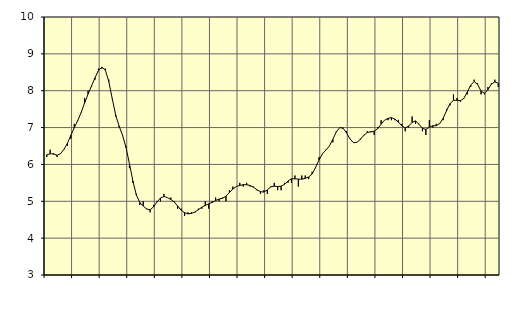
| Category | Piggar | Byggverksamhet, SNI 41-43 |
|---|---|---|
| nan | 6.2 | 6.26 |
| 87.0 | 6.4 | 6.29 |
| 87.0 | 6.3 | 6.28 |
| 87.0 | 6.2 | 6.25 |
| nan | 6.3 | 6.29 |
| 88.0 | 6.4 | 6.41 |
| 88.0 | 6.5 | 6.57 |
| 88.0 | 6.7 | 6.79 |
| nan | 7.1 | 7 |
| 89.0 | 7.2 | 7.19 |
| 89.0 | 7.4 | 7.41 |
| 89.0 | 7.8 | 7.67 |
| nan | 8 | 7.91 |
| 90.0 | 8.1 | 8.13 |
| 90.0 | 8.3 | 8.35 |
| 90.0 | 8.6 | 8.55 |
| nan | 8.6 | 8.64 |
| 91.0 | 8.6 | 8.56 |
| 91.0 | 8.3 | 8.25 |
| 91.0 | 7.8 | 7.79 |
| nan | 7.3 | 7.34 |
| 92.0 | 7 | 7.04 |
| 92.0 | 6.8 | 6.79 |
| 92.0 | 6.5 | 6.46 |
| nan | 5.9 | 6.02 |
| 93.0 | 5.5 | 5.55 |
| 93.0 | 5.2 | 5.17 |
| 93.0 | 4.9 | 4.97 |
| nan | 5 | 4.87 |
| 94.0 | 4.8 | 4.79 |
| 94.0 | 4.7 | 4.77 |
| 94.0 | 4.9 | 4.85 |
| nan | 5 | 4.98 |
| 95.0 | 5 | 5.09 |
| 95.0 | 5.2 | 5.13 |
| 95.0 | 5.1 | 5.1 |
| nan | 5.1 | 5.05 |
| 96.0 | 5 | 4.98 |
| 96.0 | 4.8 | 4.87 |
| 96.0 | 4.8 | 4.76 |
| nan | 4.6 | 4.69 |
| 97.0 | 4.7 | 4.66 |
| 97.0 | 4.7 | 4.67 |
| 97.0 | 4.7 | 4.71 |
| nan | 4.8 | 4.77 |
| 98.0 | 4.8 | 4.84 |
| 98.0 | 5 | 4.89 |
| 98.0 | 4.8 | 4.93 |
| nan | 5 | 4.97 |
| 99.0 | 5.1 | 5.02 |
| 99.0 | 5 | 5.06 |
| 99.0 | 5.1 | 5.08 |
| nan | 5 | 5.14 |
| 0.0 | 5.3 | 5.24 |
| 0.0 | 5.4 | 5.33 |
| 0.0 | 5.4 | 5.4 |
| nan | 5.5 | 5.43 |
| 1.0 | 5.4 | 5.45 |
| 1.0 | 5.5 | 5.45 |
| 1.0 | 5.4 | 5.43 |
| nan | 5.4 | 5.38 |
| 2.0 | 5.3 | 5.31 |
| 2.0 | 5.2 | 5.26 |
| 2.0 | 5.3 | 5.25 |
| nan | 5.2 | 5.31 |
| 3.0 | 5.4 | 5.39 |
| 3.0 | 5.5 | 5.41 |
| 3.0 | 5.3 | 5.4 |
| nan | 5.3 | 5.41 |
| 4.0 | 5.5 | 5.46 |
| 4.0 | 5.5 | 5.55 |
| 4.0 | 5.5 | 5.61 |
| nan | 5.7 | 5.61 |
| 5.0 | 5.4 | 5.6 |
| 5.0 | 5.7 | 5.6 |
| 5.0 | 5.7 | 5.62 |
| nan | 5.6 | 5.66 |
| 6.0 | 5.8 | 5.74 |
| 6.0 | 5.9 | 5.92 |
| 6.0 | 6.2 | 6.12 |
| nan | 6.3 | 6.29 |
| 7.0 | 6.4 | 6.39 |
| 7.0 | 6.5 | 6.5 |
| 7.0 | 6.6 | 6.68 |
| nan | 6.9 | 6.88 |
| 8.0 | 7 | 7 |
| 8.0 | 7 | 6.98 |
| 8.0 | 6.9 | 6.85 |
| nan | 6.7 | 6.69 |
| 9.0 | 6.6 | 6.59 |
| 9.0 | 6.6 | 6.6 |
| 9.0 | 6.7 | 6.68 |
| nan | 6.8 | 6.79 |
| 10.0 | 6.9 | 6.87 |
| 10.0 | 6.9 | 6.88 |
| 10.0 | 6.8 | 6.9 |
| nan | 7 | 6.97 |
| 11.0 | 7.2 | 7.09 |
| 11.0 | 7.2 | 7.2 |
| 11.0 | 7.2 | 7.25 |
| nan | 7.2 | 7.27 |
| 12.0 | 7.2 | 7.23 |
| 12.0 | 7.2 | 7.15 |
| 12.0 | 7.1 | 7.05 |
| nan | 6.9 | 6.99 |
| 13.0 | 7 | 7.04 |
| 13.0 | 7.3 | 7.14 |
| 13.0 | 7.1 | 7.18 |
| nan | 7.1 | 7.09 |
| 14.0 | 6.9 | 6.98 |
| 14.0 | 6.8 | 6.95 |
| 14.0 | 7.2 | 7.01 |
| nan | 7 | 7.05 |
| 15.0 | 7.1 | 7.05 |
| 15.0 | 7.1 | 7.11 |
| 15.0 | 7.2 | 7.25 |
| nan | 7.5 | 7.46 |
| 16.0 | 7.6 | 7.65 |
| 16.0 | 7.9 | 7.74 |
| 16.0 | 7.8 | 7.74 |
| nan | 7.7 | 7.73 |
| 17.0 | 7.8 | 7.79 |
| 17.0 | 7.9 | 7.96 |
| 17.0 | 8.1 | 8.15 |
| nan | 8.3 | 8.25 |
| 18.0 | 8.2 | 8.17 |
| 18.0 | 7.9 | 7.99 |
| 18.0 | 7.9 | 7.93 |
| nan | 8.1 | 8.03 |
| 19.0 | 8.2 | 8.18 |
| 19.0 | 8.3 | 8.24 |
| 19.0 | 8.1 | 8.2 |